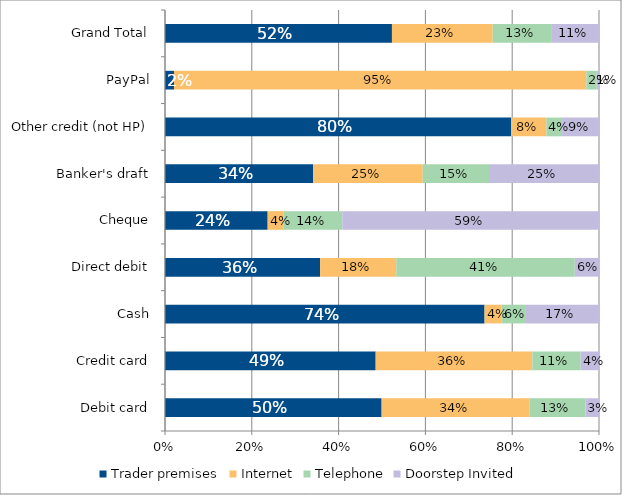
| Category | Trader premises | Internet | Telephone | Doorstep Invited |
|---|---|---|---|---|
| Debit card | 0.499 | 0.341 | 0.129 | 0.031 |
| Credit card | 0.485 | 0.361 | 0.111 | 0.042 |
| Cash | 0.736 | 0.039 | 0.056 | 0.168 |
| Direct debit | 0.357 | 0.176 | 0.411 | 0.056 |
| Cheque | 0.237 | 0.037 | 0.135 | 0.592 |
| Banker's draft | 0.341 | 0.253 | 0.153 | 0.253 |
| Other credit (not HP) | 0.798 | 0.081 | 0.036 | 0.085 |
| PayPal | 0.021 | 0.95 | 0.024 | 0.005 |
| Grand Total | 0.523 | 0.232 | 0.135 | 0.11 |